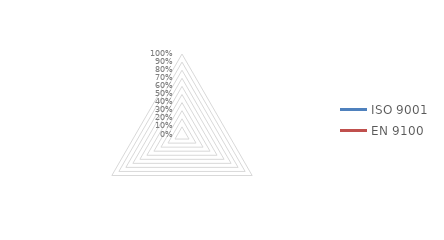
| Category | ISO 9001 | EN 9100 |
|---|---|---|
| Article 9.1  : Surveillance, mesure, analyse et évaluation | 0 | 0 |
| Article 9.2  : Audit interne | 0 | 0 |
| Article 9.3  : Revue de direction | 0 | 0 |